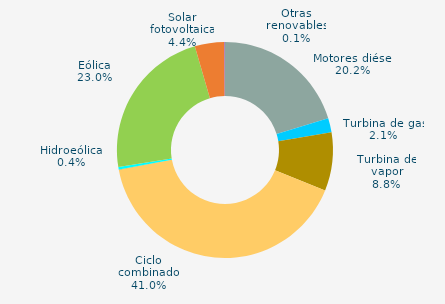
| Category | Series 0 |
|---|---|
| Motores diésel | 20.245 |
| Turbina de gas | 2.13 |
| Turbina de vapor | 8.756 |
| Ciclo combinado | 40.957 |
| Cogeneración | 0 |
| Hidráulica | 0.041 |
| Hidroeólica | 0.354 |
| Eólica | 23.01 |
| Solar fotovoltaica | 4.408 |
| Otras renovables | 0.101 |